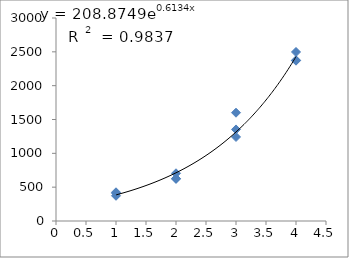
| Category | Series 0 |
|---|---|
| 1.0 | 372.781 |
| 1.0 | 424.445 |
| 1.0 | 411.728 |
| 2.0 | 705.417 |
| 2.0 | 621.487 |
| 2.0 | 627.482 |
| 3.0 | 1241.854 |
| 3.0 | 1600.276 |
| 3.0 | 1352.914 |
| 4.0 | 2375.939 |
| 4.0 | 2497.605 |
| 4.0 | 2369.052 |